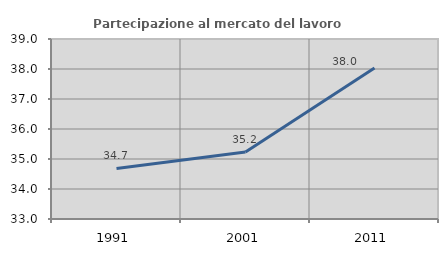
| Category | Partecipazione al mercato del lavoro  femminile |
|---|---|
| 1991.0 | 34.686 |
| 2001.0 | 35.23 |
| 2011.0 | 38.031 |